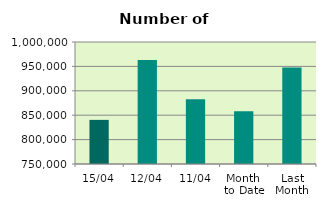
| Category | Series 0 |
|---|---|
| 15/04 | 840424 |
| 12/04 | 962928 |
| 11/04 | 882616 |
| Month 
to Date | 857892 |
| Last
Month | 947588.19 |